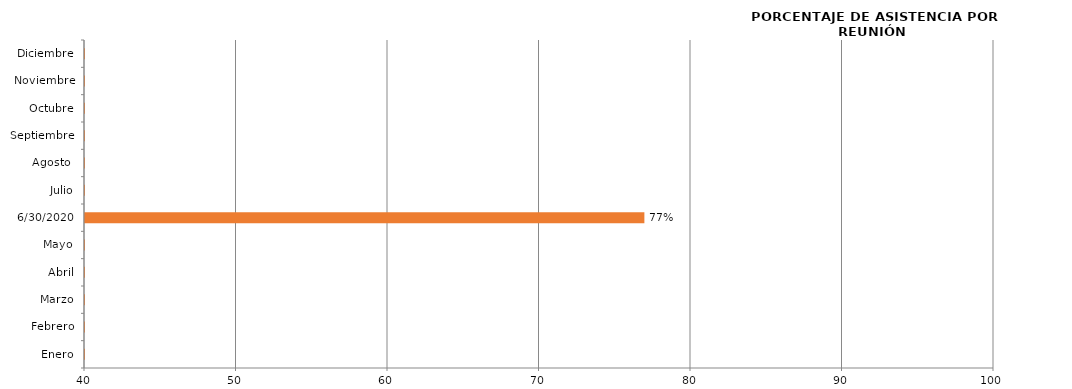
| Category | Series 0 |
|---|---|
| Enero | 0 |
| Febrero | 0 |
| Marzo | 0 |
| Abril | 0 |
| Mayo | 0 |
| 30/06/2020 | 76.923 |
| Julio | 0 |
| Agosto  | 0 |
| Septiembre | 0 |
| Octubre | 0 |
| Noviembre | 0 |
| Diciembre | 0 |